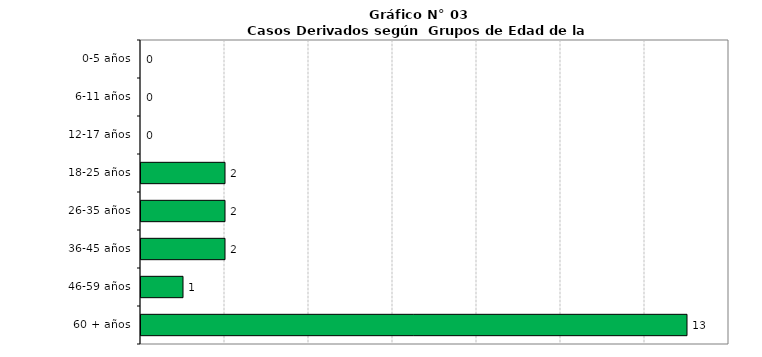
| Category | Series 0 |
|---|---|
| 0-5 años | 0 |
| 6-11 años | 0 |
| 12-17 años | 0 |
| 18-25 años | 2 |
| 26-35 años | 2 |
| 36-45 años | 2 |
| 46-59 años | 1 |
| 60 + años | 13 |